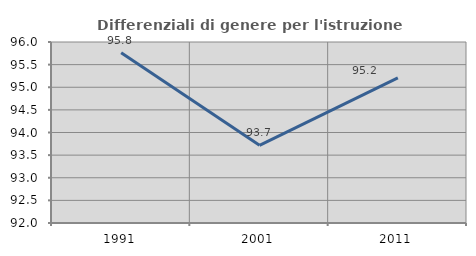
| Category | Differenziali di genere per l'istruzione superiore |
|---|---|
| 1991.0 | 95.761 |
| 2001.0 | 93.717 |
| 2011.0 | 95.209 |